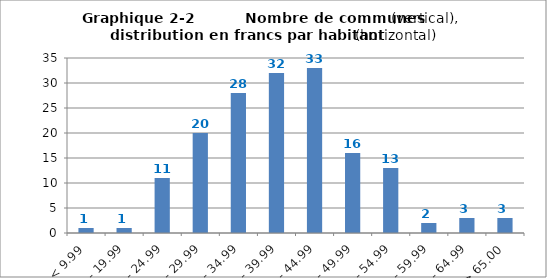
| Category | en francs par habitant |
|---|---|
| < 9.99 | 1 |
| 10.00 - 19.99 | 1 |
| 20.00 - 24.99 | 11 |
| 25.00 - 29.99 | 20 |
| 30.00 - 34.99 | 28 |
| 35.00 - 39.99 | 32 |
| 40.00 - 44.99 | 33 |
| 45.00 - 49.99 | 16 |
| 50.00 - 54.99 | 13 |
| 55.00 - 59.99 | 2 |
| 60.00 - 64.99 | 3 |
| > 65.00 | 3 |